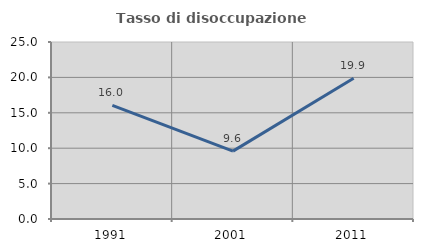
| Category | Tasso di disoccupazione giovanile  |
|---|---|
| 1991.0 | 16.047 |
| 2001.0 | 9.589 |
| 2011.0 | 19.876 |